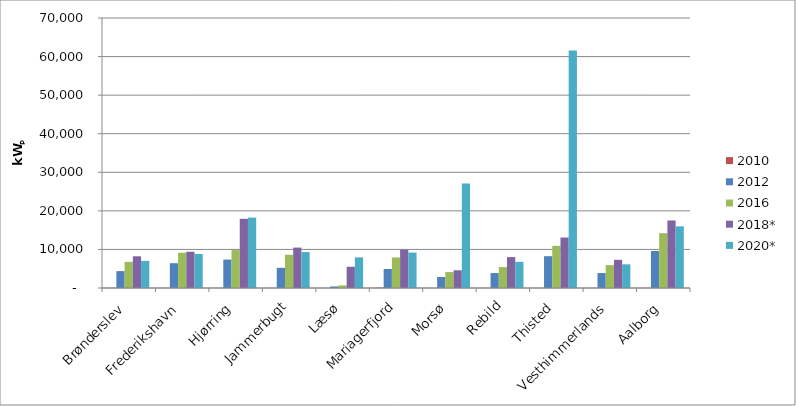
| Category | 2010 | 2012 | 2016 | 2018* | 2020* |
|---|---|---|---|---|---|
| Brønderslev | 23 | 4380.7 | 6783 | 8225.295 | 7027.438 |
| Frederikshavn | 13 | 6427.7 | 9142.3 | 9394.869 | 8817.771 |
| Hjørring | 12.1 | 7366.6 | 9828.7 | 17938.972 | 18250.299 |
| Jammerbugt | 0 | 5227.5 | 8626.3 | 10483.023 | 9321.182 |
| Læsø | 0 | 409 | 684.5 | 5508.692 | 7941.389 |
| Mariagerfjord | 85.9 | 4934.2 | 7929 | 9921.569 | 9189.991 |
| Morsø | 6 | 2854.8 | 4133.7 | 4594.823 | 27106.576 |
| Rebild | 12 | 3876.8 | 5411.1 | 8011.541 | 6785.782 |
| Thisted | 27.4 | 8250.7 | 10927.5 | 13094.778 | 61584.751 |
| Vesthimmerlands | 5 | 3876.8 | 5931.2 | 7305.354 | 6134.811 |
| Aalborg | 38.3 | 9596.4 | 14215.9 | 17506.56 | 15981.896 |